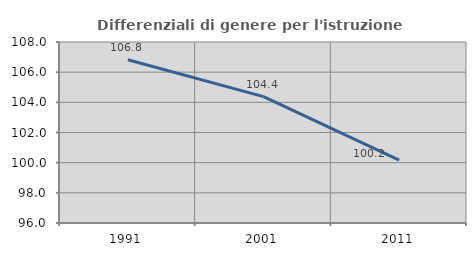
| Category | Differenziali di genere per l'istruzione superiore |
|---|---|
| 1991.0 | 106.824 |
| 2001.0 | 104.375 |
| 2011.0 | 100.168 |